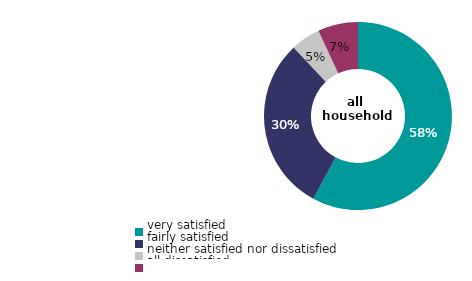
| Category | all 
tenures |
|---|---|
| very satisfied | 57.895 |
| fairly satisfied | 30.122 |
| neither satisfied nor dissatisfied | 5.067 |
| all dissatisfied | 6.916 |